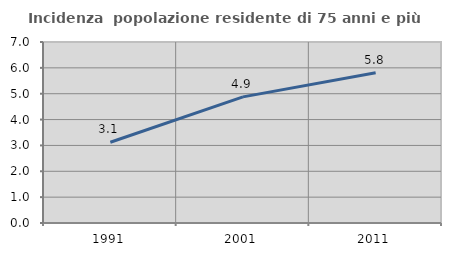
| Category | Incidenza  popolazione residente di 75 anni e più |
|---|---|
| 1991.0 | 3.123 |
| 2001.0 | 4.878 |
| 2011.0 | 5.81 |